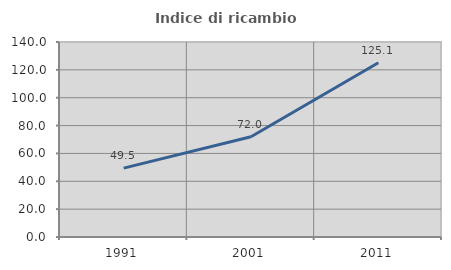
| Category | Indice di ricambio occupazionale  |
|---|---|
| 1991.0 | 49.479 |
| 2001.0 | 71.978 |
| 2011.0 | 125.127 |